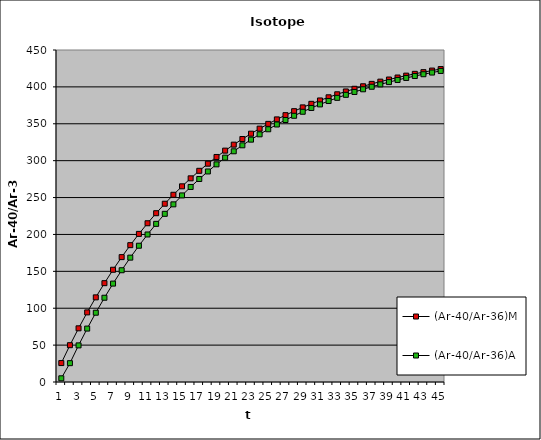
| Category | (Ar-40/Ar-36)M | (Ar-40/Ar-36)A |
|---|---|---|
| 0 | 25.661 | 5 |
| 1 | 49.885 | 25.532 |
| 2 | 72.754 | 49.641 |
| 3 | 94.343 | 72.408 |
| 4 | 114.724 | 93.907 |
| 5 | 133.964 | 114.208 |
| 6 | 152.127 | 133.378 |
| 7 | 169.274 | 151.481 |
| 8 | 185.461 | 168.575 |
| 9 | 200.742 | 184.718 |
| 10 | 215.168 | 199.961 |
| 11 | 228.786 | 214.355 |
| 12 | 241.642 | 227.948 |
| 13 | 253.779 | 240.784 |
| 14 | 265.237 | 252.905 |
| 15 | 276.053 | 264.35 |
| 16 | 286.264 | 275.159 |
| 17 | 295.903 | 285.366 |
| 18 | 305.003 | 295.004 |
| 19 | 313.594 | 304.105 |
| 20 | 321.704 | 312.7 |
| 21 | 329.36 | 320.816 |
| 22 | 336.588 | 328.48 |
| 23 | 343.411 | 335.718 |
| 24 | 349.852 | 342.552 |
| 25 | 355.932 | 349.006 |
| 26 | 361.673 | 355.101 |
| 27 | 367.092 | 360.856 |
| 28 | 372.208 | 366.291 |
| 29 | 377.037 | 371.423 |
| 30 | 381.596 | 376.27 |
| 31 | 385.9 | 380.846 |
| 32 | 389.964 | 385.168 |
| 33 | 393.799 | 389.249 |
| 34 | 397.42 | 393.103 |
| 35 | 400.839 | 396.743 |
| 36 | 404.066 | 400.18 |
| 37 | 407.112 | 403.425 |
| 38 | 409.988 | 406.49 |
| 39 | 412.703 | 409.385 |
| 40 | 415.267 | 412.118 |
| 41 | 417.686 | 414.699 |
| 42 | 419.97 | 417.136 |
| 43 | 422.127 | 419.438 |
| 44 | 424.162 | 421.611 |